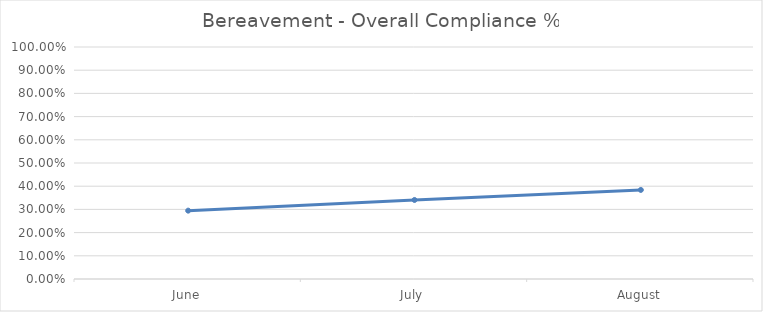
| Category | Bereavement - Overall Compliance % |
|---|---|
| June | 0.295 |
| July | 0.341 |
| August | 0.384 |